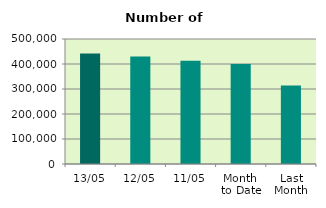
| Category | Series 0 |
|---|---|
| 13/05 | 442288 |
| 12/05 | 430404 |
| 11/05 | 413150 |
| Month 
to Date | 399671.2 |
| Last
Month | 313751.158 |